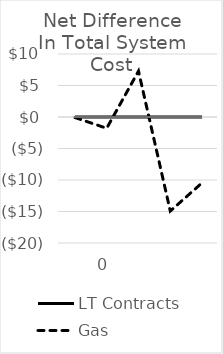
| Category | LT Contracts | Gas |
|---|---|---|
| nan | 0 | -0.082 |
| 0.0 | 0 | -1.788 |
| nan | 0 | 7.289 |
| nan | 0 | -14.932 |
| nan | 0 | -10.446 |